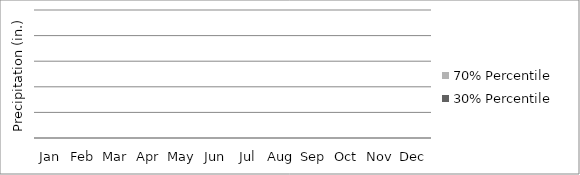
| Category | 30% Percentile | 70% Percentile |
|---|---|---|
| Jan | 0 | 0 |
| Feb | 0 | 0 |
| Mar | 0 | 0 |
| Apr | 0 | 0 |
| May | 0 | 0 |
| Jun | 0 | 0 |
| Jul | 0 | 0 |
| Aug | 0 | 0 |
| Sep | 0 | 0 |
| Oct | 0 | 0 |
| Nov | 0 | 0 |
| Dec | 0 | 0 |